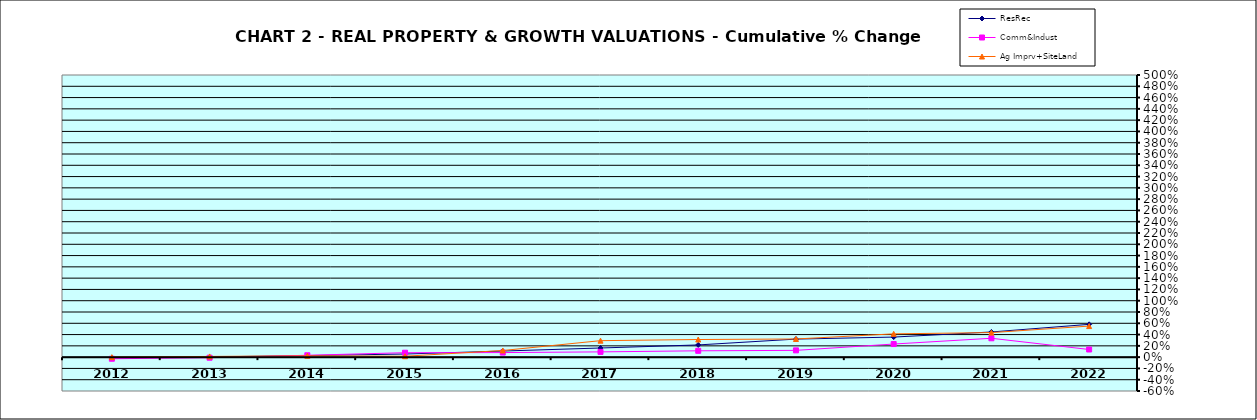
| Category | ResRec | Comm&Indust | Ag Imprv+SiteLand |
|---|---|---|---|
| 2012.0 | -0.011 | -0.028 | 0 |
| 2013.0 | 0.004 | -0.01 | 0.013 |
| 2014.0 | 0.028 | 0.033 | 0.023 |
| 2015.0 | 0.055 | 0.078 | 0.016 |
| 2016.0 | 0.108 | 0.081 | 0.118 |
| 2017.0 | 0.162 | 0.093 | 0.292 |
| 2018.0 | 0.216 | 0.112 | 0.312 |
| 2019.0 | 0.32 | 0.12 | 0.322 |
| 2020.0 | 0.356 | 0.232 | 0.413 |
| 2021.0 | 0.446 | 0.334 | 0.435 |
| 2022.0 | 0.581 | 0.136 | 0.55 |